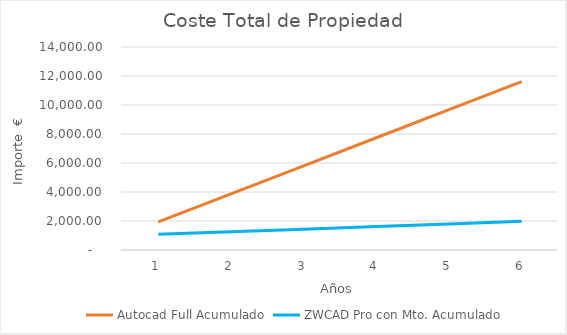
| Category | Autocad Full Acumulado | ZWCAD Pro con Mto. Acumulado |
|---|---|---|
| 0 | 1935 | 1079 |
| 1 | 3870 | 1259 |
| 2 | 5805 | 1439 |
| 3 | 7740 | 1619 |
| 4 | 9675 | 1799 |
| 5 | 11610 | 1979 |